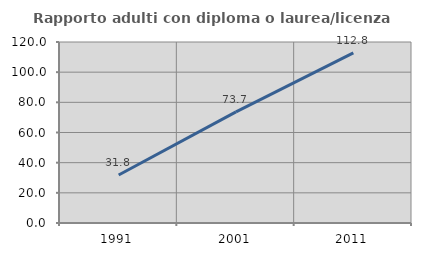
| Category | Rapporto adulti con diploma o laurea/licenza media  |
|---|---|
| 1991.0 | 31.837 |
| 2001.0 | 73.664 |
| 2011.0 | 112.781 |